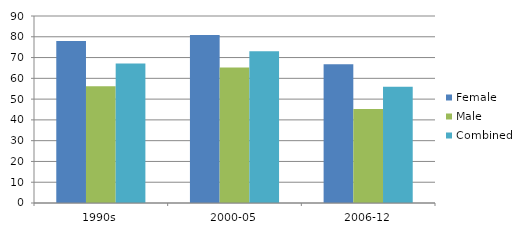
| Category | Female | Male | Combined |
|---|---|---|---|
| 1990s | 78 | 56.2 | 67.1 |
| 2000-05 | 80.9 | 65.2 | 73 |
| 2006-12 | 66.8 | 45.2 | 56 |